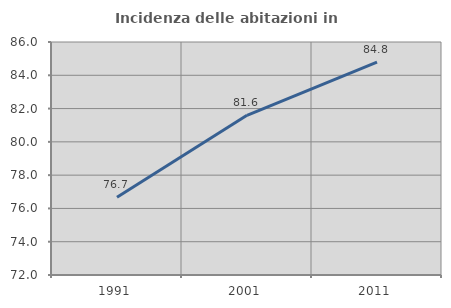
| Category | Incidenza delle abitazioni in proprietà  |
|---|---|
| 1991.0 | 76.668 |
| 2001.0 | 81.594 |
| 2011.0 | 84.794 |